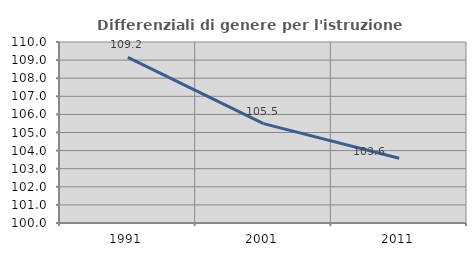
| Category | Differenziali di genere per l'istruzione superiore |
|---|---|
| 1991.0 | 109.153 |
| 2001.0 | 105.488 |
| 2011.0 | 103.575 |